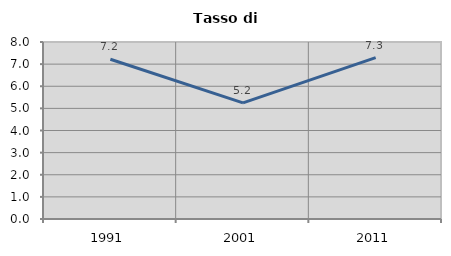
| Category | Tasso di disoccupazione   |
|---|---|
| 1991.0 | 7.219 |
| 2001.0 | 5.249 |
| 2011.0 | 7.296 |